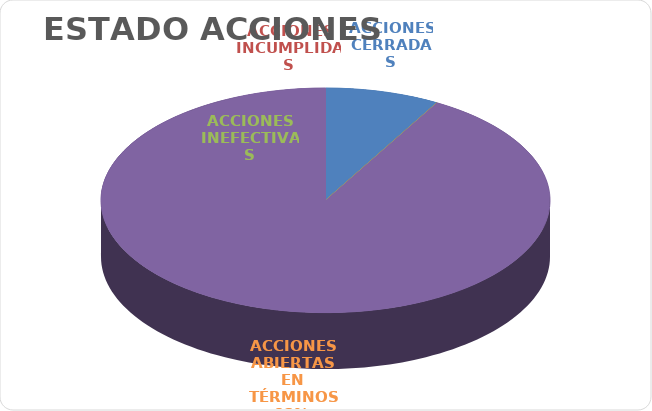
| Category | Series 0 |
|---|---|
| ACCIONES CERRADAS | 9 |
| ACCIONES INCUMPLIDAS | 0 |
| ACCIONES INEFECTIVAS | 0 |
| ACCIONES ABIERTAS EN TÉRMINOS | 100 |